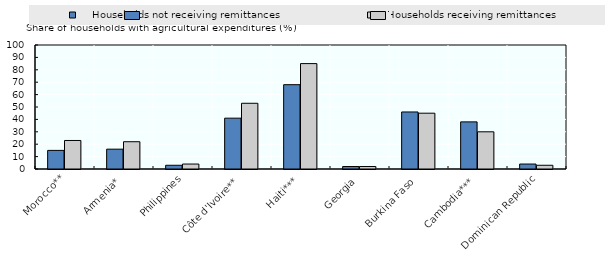
| Category |     Households not receiving remittances |    Households receiving remittances |
|---|---|---|
| Morocco** | 15 | 23 |
| Armenia* | 16 | 22 |
| Philippines | 3 | 4 |
| Côte d'Ivoire** | 41 | 53 |
| Haiti*** | 68 | 85 |
| Georgia | 2 | 2 |
| Burkina Faso | 46 | 45 |
| Cambodia*** | 38 | 30 |
| Dominican Republic | 4 | 3 |